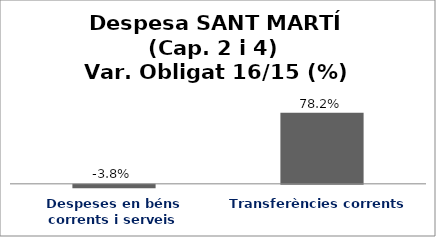
| Category | Series 0 |
|---|---|
| Despeses en béns corrents i serveis | -0.038 |
| Transferències corrents | 0.782 |